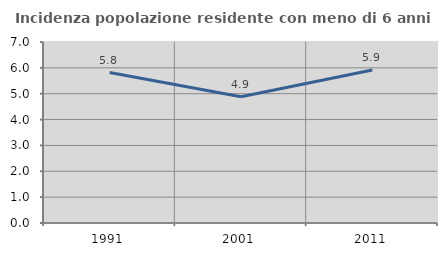
| Category | Incidenza popolazione residente con meno di 6 anni |
|---|---|
| 1991.0 | 5.819 |
| 2001.0 | 4.88 |
| 2011.0 | 5.915 |